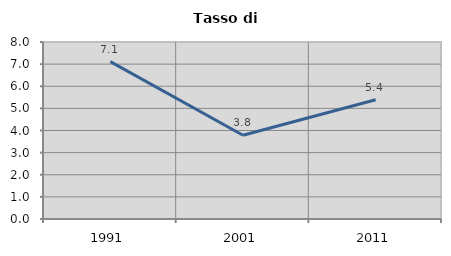
| Category | Tasso di disoccupazione   |
|---|---|
| 1991.0 | 7.113 |
| 2001.0 | 3.786 |
| 2011.0 | 5.391 |